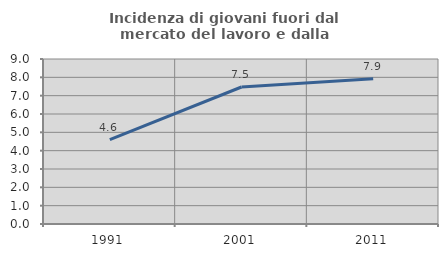
| Category | Incidenza di giovani fuori dal mercato del lavoro e dalla formazione  |
|---|---|
| 1991.0 | 4.606 |
| 2001.0 | 7.473 |
| 2011.0 | 7.922 |